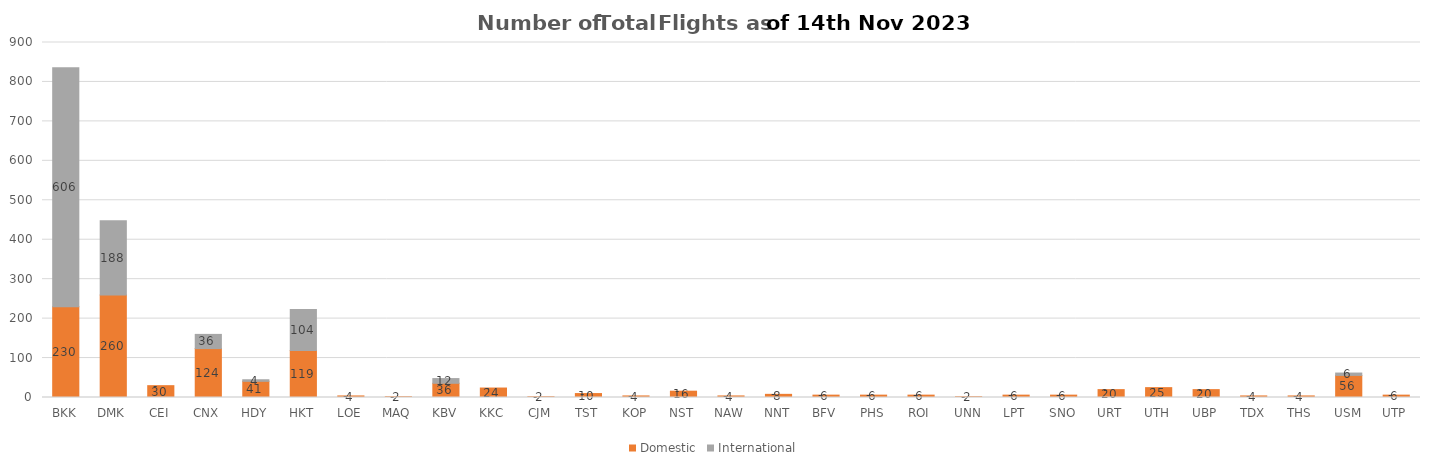
| Category | Domestic | International |
|---|---|---|
| BKK | 230 | 606 |
| DMK | 260 | 188 |
| CEI | 30 | 0 |
| CNX | 124 | 36 |
| HDY | 41 | 4 |
| HKT | 119 | 104 |
| LOE | 4 | 0 |
| MAQ | 2 | 0 |
| KBV | 36 | 12 |
| KKC | 24 | 0 |
| CJM | 2 | 0 |
| TST | 10 | 0 |
| KOP | 4 | 0 |
| NST | 16 | 0 |
| NAW | 4 | 0 |
| NNT | 8 | 0 |
| BFV | 6 | 0 |
| PHS | 6 | 0 |
| ROI | 6 | 0 |
| UNN | 2 | 0 |
| LPT | 6 | 0 |
| SNO | 6 | 0 |
| URT | 20 | 0 |
| UTH | 25 | 0 |
| UBP | 20 | 0 |
| TDX | 4 | 0 |
| THS | 4 | 0 |
| USM | 56 | 6 |
| UTP | 6 | 0 |